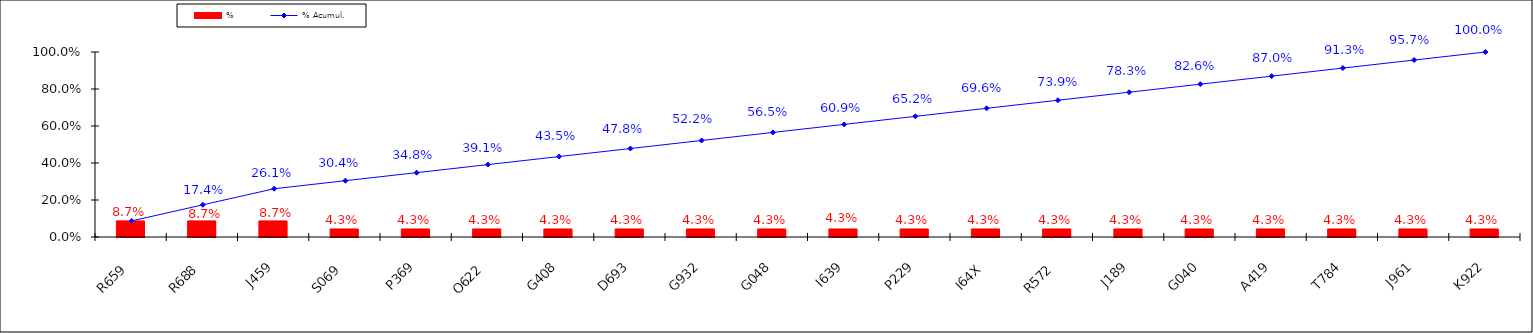
| Category | % |
|---|---|
| R659 | 0.087 |
| R688 | 0.087 |
| J459 | 0.087 |
| S069 | 0.043 |
| P369 | 0.043 |
| O622 | 0.043 |
| G408 | 0.043 |
| D693 | 0.043 |
| G932 | 0.043 |
| G048 | 0.043 |
| I639 | 0.043 |
| P229 | 0.043 |
| I64X | 0.043 |
| R572 | 0.043 |
| J189 | 0.043 |
| G040 | 0.043 |
| A419 | 0.043 |
| T784 | 0.043 |
| J961 | 0.043 |
| K922 | 0.043 |